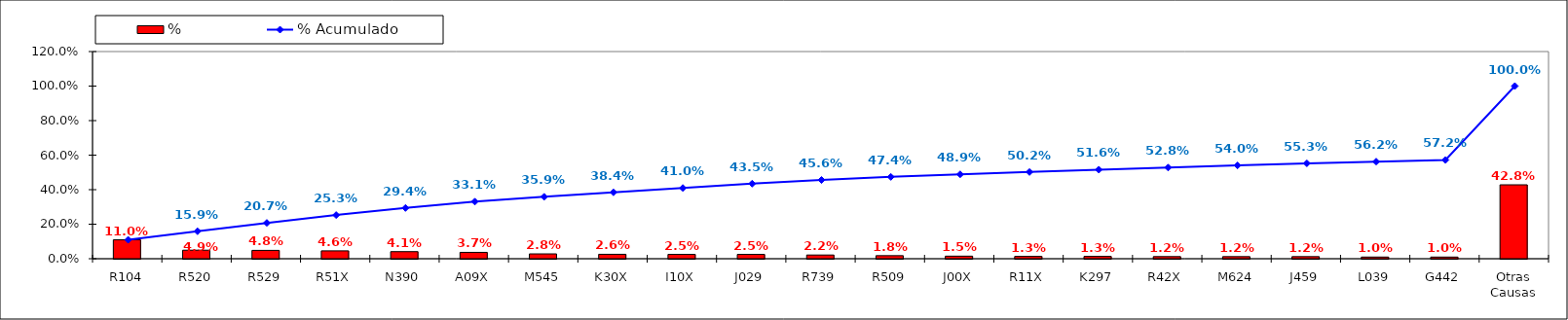
| Category | % |
|---|---|
| R104 | 0.11 |
| R520 | 0.049 |
| R529 | 0.048 |
| R51X | 0.046 |
| N390 | 0.041 |
| A09X | 0.037 |
| M545 | 0.028 |
| K30X | 0.026 |
| I10X | 0.025 |
| J029 | 0.025 |
| R739 | 0.022 |
| R509 | 0.018 |
| J00X | 0.015 |
| R11X | 0.013 |
| K297 | 0.013 |
| R42X | 0.012 |
| M624 | 0.012 |
| J459 | 0.012 |
| L039 | 0.01 |
| G442 | 0.01 |
| Otras Causas | 0.428 |